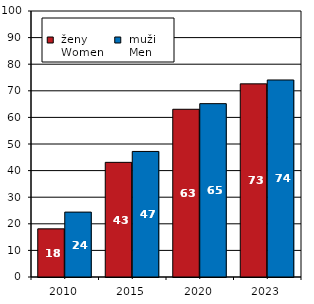
| Category |  ženy 
 Women |  muži 
 Men |
|---|---|---|
| 2010.0 | 18.1 | 24.4 |
| 2015.0 | 43.1 | 47.2 |
| 2020.0 | 63.054 | 65.173 |
| 2023.0 | 72.611 | 74.068 |